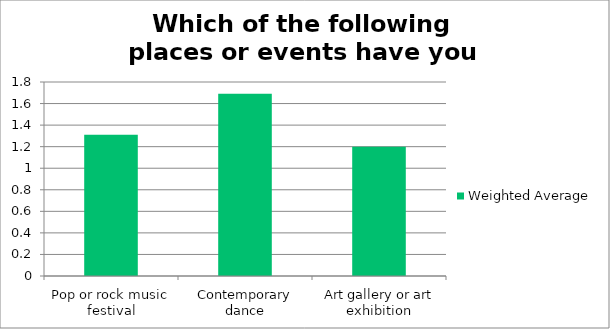
| Category | Weighted Average |
|---|---|
| Pop or rock music festival | 1.31 |
| Contemporary dance | 1.69 |
| Art gallery or art exhibition | 1.2 |